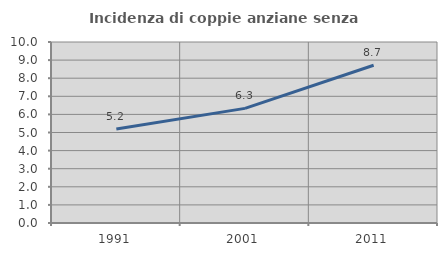
| Category | Incidenza di coppie anziane senza figli  |
|---|---|
| 1991.0 | 5.188 |
| 2001.0 | 6.333 |
| 2011.0 | 8.718 |